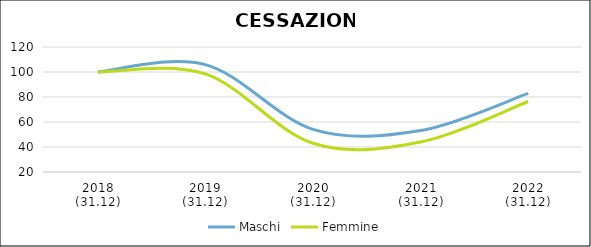
| Category | Maschi | Femmine |
|---|---|---|
| 2018
(31.12) | 100 | 100 |
| 2019
(31.12) | 105.933 | 98.458 |
| 2020
(31.12) | 54.139 | 42.973 |
| 2021
(31.12) | 53.179 | 44.049 |
| 2022
(31.12) | 82.866 | 76.421 |